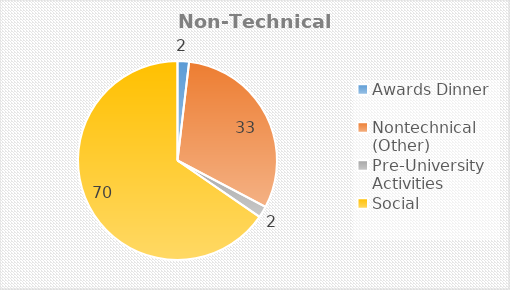
| Category | Series 1 | Series 0 |
|---|---|---|
| Awards Dinner | 2 | 2 |
| Nontechnical (Other) | 33 | 33 |
| Pre-University Activities | 2 | 2 |
| Social | 70 | 70 |